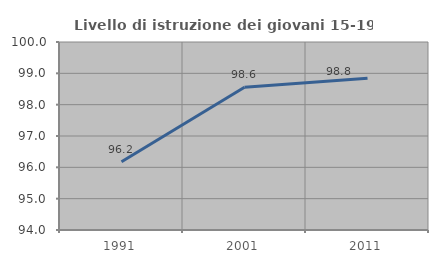
| Category | Livello di istruzione dei giovani 15-19 anni |
|---|---|
| 1991.0 | 96.176 |
| 2001.0 | 98.557 |
| 2011.0 | 98.845 |